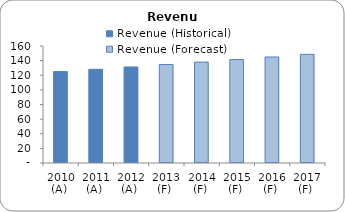
| Category | Revenue (Historical) | Revenue (Forecast) |
|---|---|---|
| 2010 (A)  | 125 | 0 |
| 2011 (A)  | 128.125 | 0 |
| 2012 (A)  | 131.328 | 0 |
| 2013 (F)  | 0 | 134.611 |
| 2014 (F)  | 0 | 137.977 |
| 2015 (F)  | 0 | 141.426 |
| 2016 (F)  | 0 | 144.962 |
| 2017 (F)  | 0 | 148.586 |